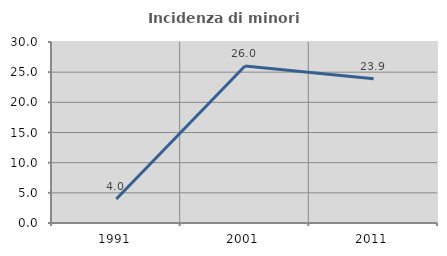
| Category | Incidenza di minori stranieri |
|---|---|
| 1991.0 | 3.968 |
| 2001.0 | 26.024 |
| 2011.0 | 23.898 |